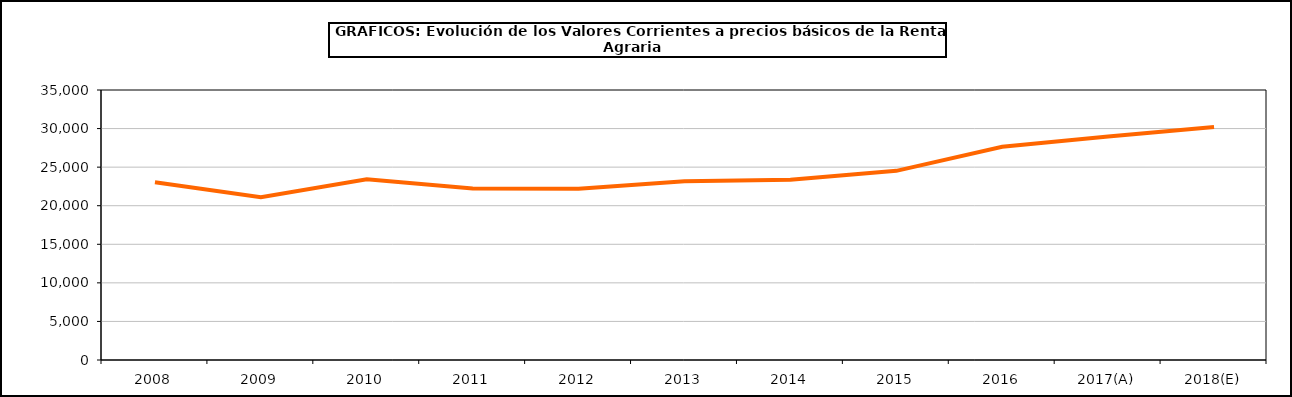
| Category | renta agraria |
|---|---|
| 2008 | 23031.6 |
| 2009 | 21101 |
| 2010 | 23433.2 |
| 2011 | 22219.2 |
| 2012 | 22193.5 |
| 2013 | 23161.5 |
| 2014 | 23361.1 |
| 2015 | 24518.8 |
| 2016 | 27646.8 |
| 2017(A) | 28958.3 |
| 2018(E) | 30217 |